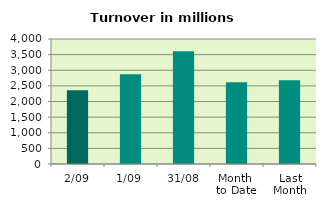
| Category | Series 0 |
|---|---|
| 2/09 | 2359.817 |
| 1/09 | 2873.709 |
| 31/08 | 3604.563 |
| Month 
to Date | 2616.763 |
| Last
Month | 2681.097 |